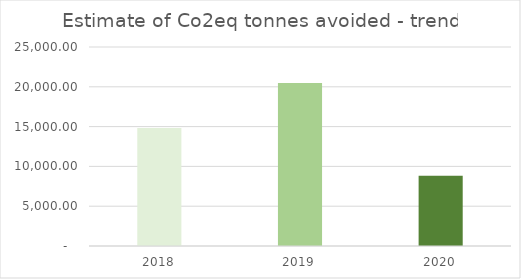
| Category | Series 0 |
|---|---|
| 0 | 14821.15 |
| 1 | 20484 |
| 2 | 8818 |